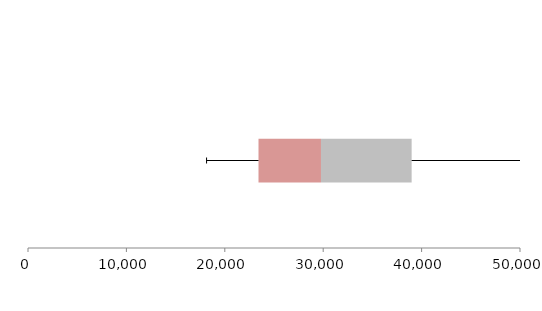
| Category | Series 1 | Series 2 | Series 3 |
|---|---|---|---|
| 0 | 23425.617 | 6349.02 | 9213.641 |